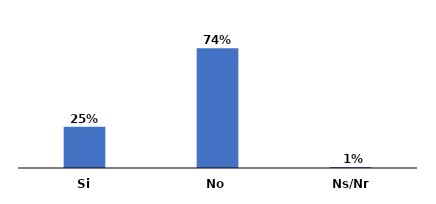
| Category | Series 0 |
|---|---|
| Si | 0.254 |
| No | 0.74 |
| Ns/Nr | 0.006 |